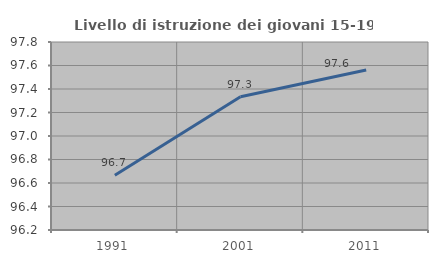
| Category | Livello di istruzione dei giovani 15-19 anni |
|---|---|
| 1991.0 | 96.667 |
| 2001.0 | 97.333 |
| 2011.0 | 97.561 |